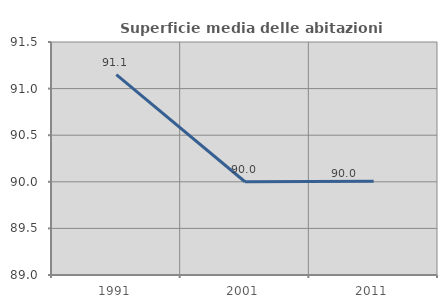
| Category | Superficie media delle abitazioni occupate |
|---|---|
| 1991.0 | 91.149 |
| 2001.0 | 90.001 |
| 2011.0 | 90.005 |